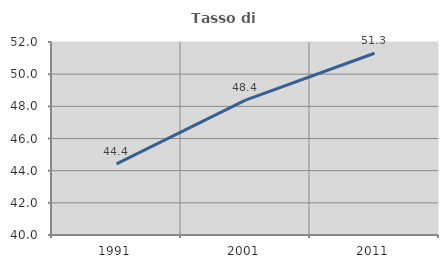
| Category | Tasso di occupazione   |
|---|---|
| 1991.0 | 44.419 |
| 2001.0 | 48.387 |
| 2011.0 | 51.3 |